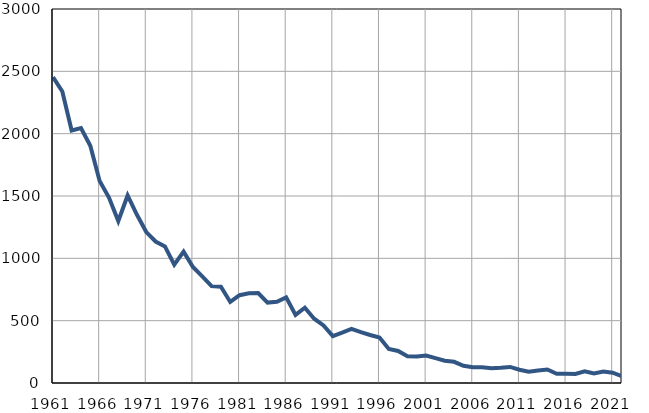
| Category | Умрла 
одојчад |
|---|---|
| 1961.0 | 2453 |
| 1962.0 | 2338 |
| 1963.0 | 2025 |
| 1964.0 | 2045 |
| 1965.0 | 1903 |
| 1966.0 | 1620 |
| 1967.0 | 1488 |
| 1968.0 | 1299 |
| 1969.0 | 1504 |
| 1970.0 | 1349 |
| 1971.0 | 1211 |
| 1972.0 | 1135 |
| 1973.0 | 1096 |
| 1974.0 | 949 |
| 1975.0 | 1054 |
| 1976.0 | 931 |
| 1977.0 | 856 |
| 1978.0 | 777 |
| 1979.0 | 772 |
| 1980.0 | 650 |
| 1981.0 | 704 |
| 1982.0 | 720 |
| 1983.0 | 722 |
| 1984.0 | 645 |
| 1985.0 | 651 |
| 1986.0 | 687 |
| 1987.0 | 546 |
| 1988.0 | 604 |
| 1989.0 | 516 |
| 1990.0 | 462 |
| 1991.0 | 376 |
| 1992.0 | 404 |
| 1993.0 | 434 |
| 1994.0 | 408 |
| 1995.0 | 385 |
| 1996.0 | 365 |
| 1997.0 | 273 |
| 1998.0 | 257 |
| 1999.0 | 214 |
| 2000.0 | 212 |
| 2001.0 | 220 |
| 2002.0 | 199 |
| 2003.0 | 179 |
| 2004.0 | 170 |
| 2005.0 | 138 |
| 2006.0 | 127 |
| 2007.0 | 127 |
| 2008.0 | 118 |
| 2009.0 | 122 |
| 2010.0 | 129 |
| 2011.0 | 106 |
| 2012.0 | 91 |
| 2013.0 | 101 |
| 2014.0 | 108 |
| 2015.0 | 74 |
| 2016.0 | 75 |
| 2017.0 | 72 |
| 2018.0 | 94 |
| 2019.0 | 76 |
| 2020.0 | 92 |
| 2021.0 | 83 |
| 2022.0 | 55 |